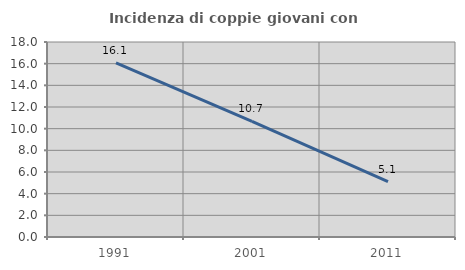
| Category | Incidenza di coppie giovani con figli |
|---|---|
| 1991.0 | 16.071 |
| 2001.0 | 10.68 |
| 2011.0 | 5.102 |